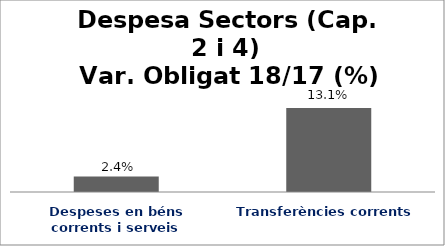
| Category | Series 0 |
|---|---|
| Despeses en béns corrents i serveis | 0.024 |
| Transferències corrents | 0.131 |